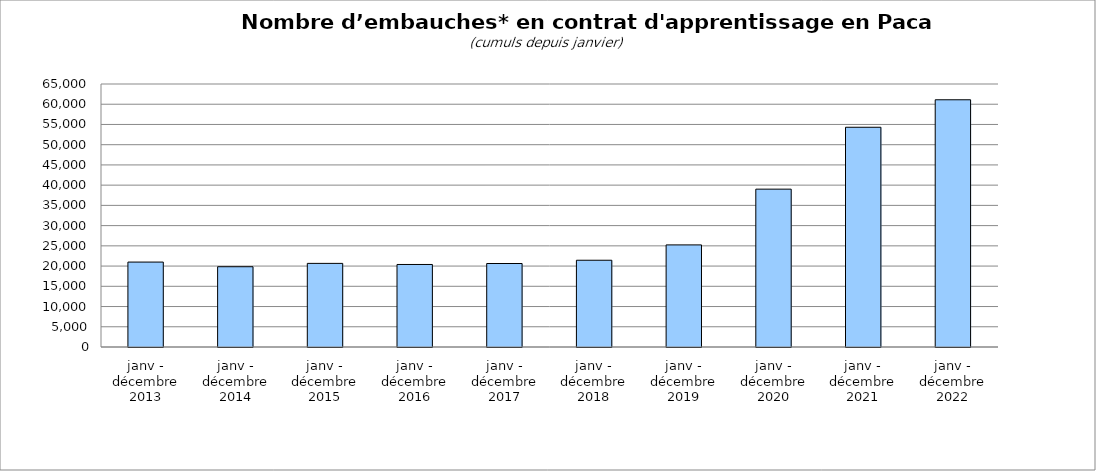
| Category | Series 0 |
|---|---|
| janv - décembre 2013 | 20990 |
| janv - décembre 2014 | 19839 |
| janv - décembre 2015 | 20667 |
| janv - décembre 2016 | 20397 |
| janv - décembre 2017 | 20635 |
| janv - décembre 2018 | 21443 |
| janv - décembre 2019 | 25235 |
| janv - décembre 2020 | 39011 |
| janv - décembre 2021 | 54309 |
| janv - décembre 2022 | 61101 |